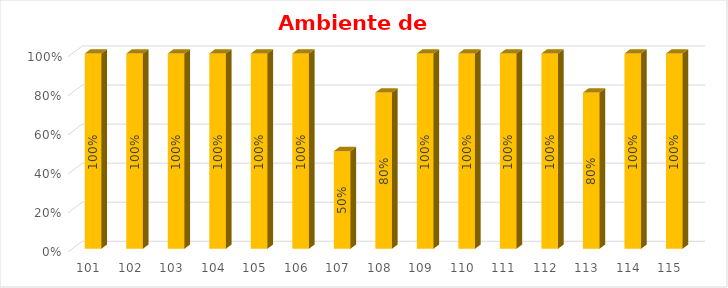
| Category | % Avance |
|---|---|
| 101.0 | 1 |
| 102.0 | 1 |
| 103.0 | 1 |
| 104.0 | 1 |
| 105.0 | 1 |
| 106.0 | 1 |
| 107.0 | 0.5 |
| 108.0 | 0.8 |
| 109.0 | 1 |
| 110.0 | 1 |
| 111.0 | 1 |
| 112.0 | 1 |
| 113.0 | 0.8 |
| 114.0 | 1 |
| 115.0 | 1 |